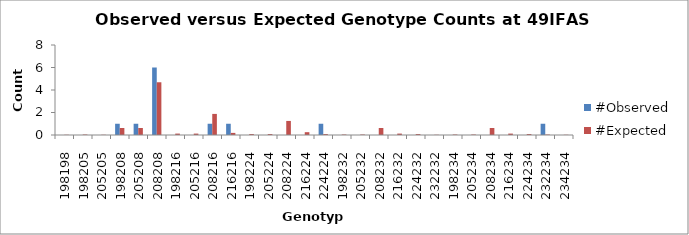
| Category | #Observed | #Expected |
|---|---|---|
| 198198.0 | 0 | 0.021 |
| 198205.0 | 0 | 0.042 |
| 205205.0 | 0 | 0.021 |
| 198208.0 | 1 | 0.625 |
| 205208.0 | 1 | 0.625 |
| 208208.0 | 6 | 4.688 |
| 198216.0 | 0 | 0.125 |
| 205216.0 | 0 | 0.125 |
| 208216.0 | 1 | 1.875 |
| 216216.0 | 1 | 0.188 |
| 198224.0 | 0 | 0.083 |
| 205224.0 | 0 | 0.083 |
| 208224.0 | 0 | 1.25 |
| 216224.0 | 0 | 0.25 |
| 224224.0 | 1 | 0.083 |
| 198232.0 | 0 | 0.042 |
| 205232.0 | 0 | 0.042 |
| 208232.0 | 0 | 0.625 |
| 216232.0 | 0 | 0.125 |
| 224232.0 | 0 | 0.083 |
| 232232.0 | 0 | 0.021 |
| 198234.0 | 0 | 0.042 |
| 205234.0 | 0 | 0.042 |
| 208234.0 | 0 | 0.625 |
| 216234.0 | 0 | 0.125 |
| 224234.0 | 0 | 0.083 |
| 232234.0 | 1 | 0.042 |
| 234234.0 | 0 | 0.021 |